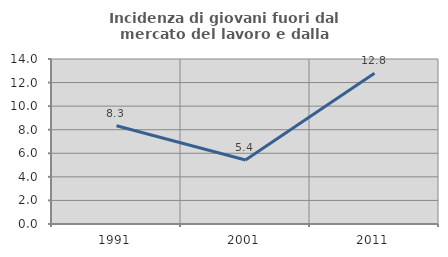
| Category | Incidenza di giovani fuori dal mercato del lavoro e dalla formazione  |
|---|---|
| 1991.0 | 8.333 |
| 2001.0 | 5.43 |
| 2011.0 | 12.791 |